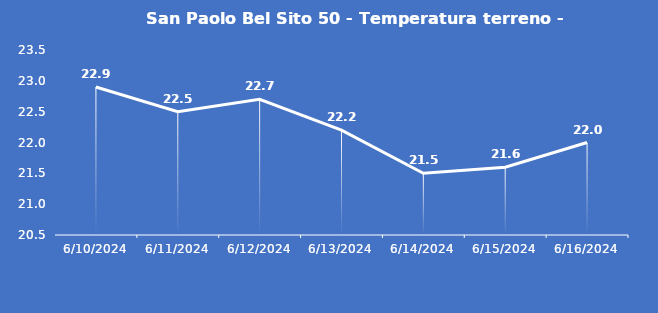
| Category | San Paolo Bel Sito 50 - Temperatura terreno - Grezzo (°C) |
|---|---|
| 6/10/24 | 22.9 |
| 6/11/24 | 22.5 |
| 6/12/24 | 22.7 |
| 6/13/24 | 22.2 |
| 6/14/24 | 21.5 |
| 6/15/24 | 21.6 |
| 6/16/24 | 22 |